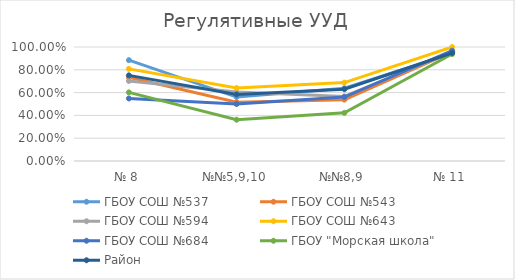
| Category | ГБОУ СОШ №537 | ГБОУ СОШ №543 | ГБОУ СОШ №594 | ГБОУ СОШ №643 | ГБОУ СОШ №684 | ГБОУ "Морская школа" | Район |
|---|---|---|---|---|---|---|---|
| № 8 | 0.885 | 0.734 | 0.702 | 0.808 | 0.548 | 0.602 | 0.751 |
| №№5,9,10 | 0.561 | 0.516 | 0.605 | 0.64 | 0.5 | 0.362 | 0.584 |
| №№8,9 | 0.638 | 0.538 | 0.566 | 0.688 | 0.561 | 0.422 | 0.63 |
| № 11 | 0.942 | 0.957 | 0.957 | 1 | 0.968 | 0.939 | 0.948 |